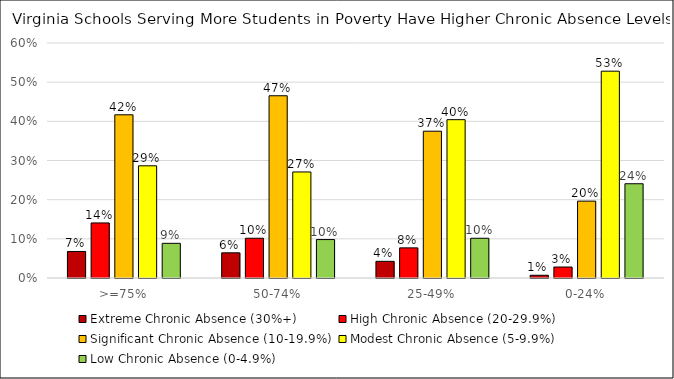
| Category | Extreme Chronic Absence (30%+) | High Chronic Absence (20-29.9%) | Significant Chronic Absence (10-19.9%) | Modest Chronic Absence (5-9.9%) | Low Chronic Absence (0-4.9%) |
|---|---|---|---|---|---|
| >=75% | 0.068 | 0.141 | 0.417 | 0.286 | 0.089 |
| 50-74% | 0.064 | 0.102 | 0.465 | 0.271 | 0.098 |
| 25-49% | 0.043 | 0.077 | 0.375 | 0.404 | 0.101 |
| 0-24% | 0.007 | 0.028 | 0.196 | 0.528 | 0.241 |